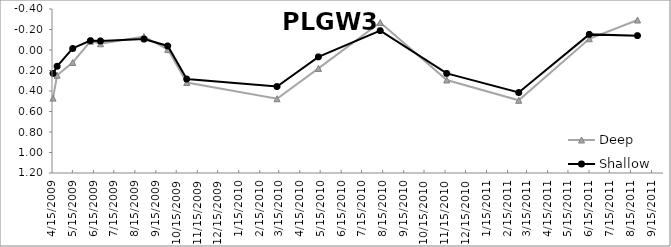
| Category | Deep | Shallow |
|---|---|---|
| 4/16/09 | 0.469 | 0.229 |
| 4/22/09 | 0.247 | 0.158 |
| 5/15/09 | 0.122 | -0.015 |
| 6/10/09 | -0.085 | -0.091 |
| 6/25/09 | -0.061 | -0.088 |
| 8/28/09 | -0.131 | -0.107 |
| 10/2/09 | -0.006 | -0.04 |
| 10/30/09 | 0.317 | 0.283 |
| 3/12/10 | 0.475 | 0.357 |
| 5/12/10 | 0.18 | 0.067 |
| 8/11/10 | -0.268 | -0.189 |
| 11/17/10 | 0.293 | 0.229 |
| 3/3/11 | 0.491 | 0.415 |
| 6/15/11 | -0.11 | -0.152 |
| 8/25/11 | -0.293 | -0.14 |